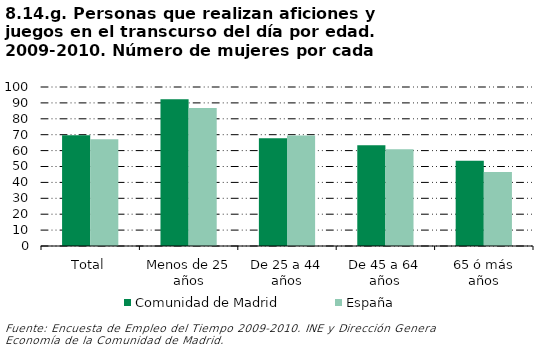
| Category | Comunidad de Madrid | España |
|---|---|---|
| Total | 69.673 | 67.135 |
| Menos de 25 años | 92.285 | 86.719 |
| De 25 a 44 años | 67.729 | 69.444 |
| De 45 a 64 años | 63.389 | 60.791 |
| 65 ó más años | 53.654 | 46.565 |